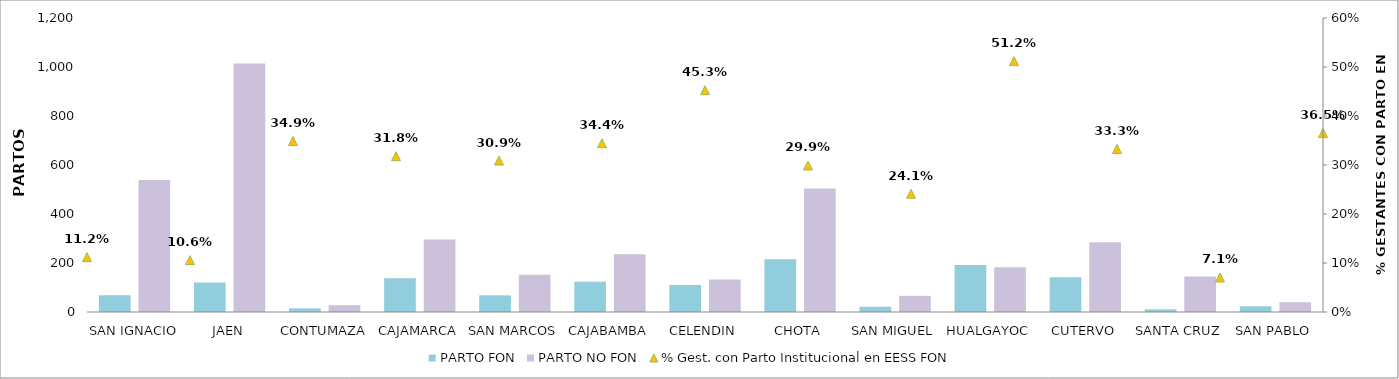
| Category | PARTO FON | PARTO NO FON |
|---|---|---|
| SAN IGNACIO | 68 | 539 |
| JAEN | 120 | 1014 |
| CONTUMAZA | 15 | 28 |
| CAJAMARCA | 138 | 296 |
| SAN MARCOS | 68 | 152 |
| CAJABAMBA | 124 | 236 |
| CELENDIN | 110 | 133 |
| CHOTA | 215 | 504 |
| SAN MIGUEL | 21 | 66 |
| HUALGAYOC | 192 | 183 |
| CUTERVO | 142 | 285 |
| SANTA CRUZ | 11 | 145 |
| SAN PABLO | 23 | 40 |